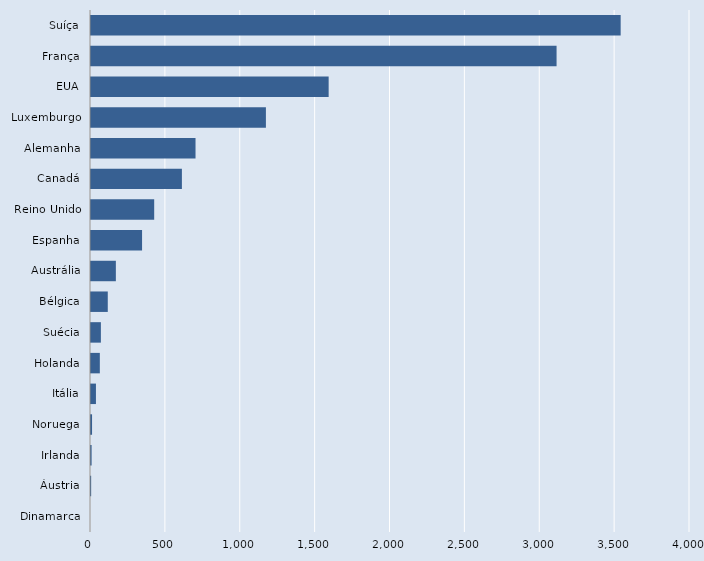
| Category | Series 0 |
|---|---|
| Dinamarca | 0 |
| Áustria | 1 |
| Irlanda | 4 |
| Noruega | 7 |
| Itália | 33 |
| Holanda | 59 |
| Suécia | 66 |
| Bélgica | 112 |
| Austrália | 166 |
| Espanha | 341 |
| Reino Unido | 422 |
| Canadá | 607 |
| Alemanha | 698 |
| Luxemburgo | 1168 |
| EUA | 1587 |
| França | 3109 |
| Suíça | 3537 |